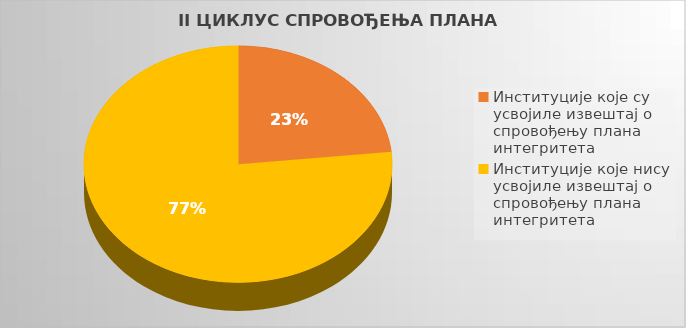
| Category | Series 0 |
|---|---|
| Институције које су усвојиле извештај о спровођењу плана интегритета | 0.233 |
| Институције које нису усвојиле извештај о спровођењу плана интегритета | 0.767 |